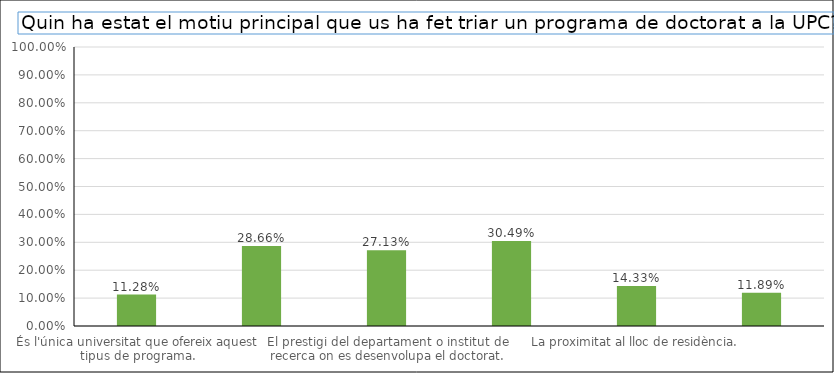
| Category | Series 0 |
|---|---|
| És l'única universitat que ofereix aquest tipus de programa. | 0.113 |
| El prestigi de la UPC. | 0.287 |
| El prestigi del departament o institut de recerca on es desenvolupa el doctorat. | 0.271 |
| El prestigi i la temàtica del grup de recerca. | 0.305 |
| La proximitat al lloc de residència. | 0.143 |
| Treballar a la UPC. | 0.119 |